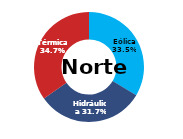
| Category | Norte |
|---|---|
| Eólica | 80.507 |
| Hidráulica | 76.189 |
| Solar | 0 |
| Térmica | 83.314 |